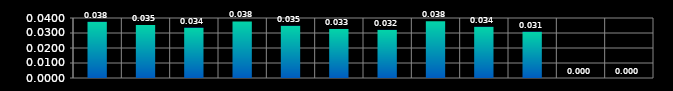
| Category | Series 0 |
|---|---|
| 0 | 0.038 |
| 1 | 0.035 |
| 2 | 0.034 |
| 3 | 0.038 |
| 4 | 0.035 |
| 5 | 0.033 |
| 6 | 0.032 |
| 7 | 0.038 |
| 8 | 0.034 |
| 9 | 0.031 |
| 10 | 0 |
| 11 | 0 |